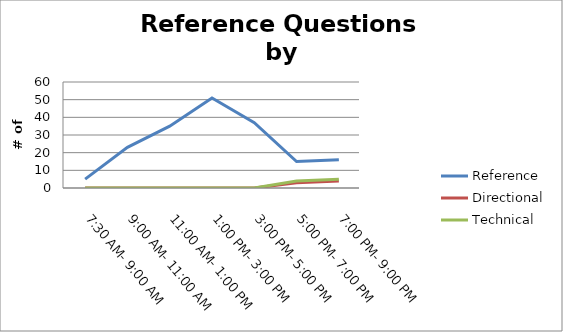
| Category | Reference | Directional | Technical |
|---|---|---|---|
| 7:30 AM- 9:00 AM | 5 | 0 | 0 |
| 9:00 AM- 11:00 AM | 23 | 0 | 0 |
| 11:00 AM- 1:00 PM | 35 | 0 | 0 |
| 1:00 PM- 3:00 PM | 51 | 0 | 0 |
| 3:00 PM- 5:00 PM | 37 | 0 | 0 |
| 5:00 PM- 7:00 PM | 15 | 3 | 4 |
| 7:00 PM- 9:00 PM | 16 | 4 | 5 |